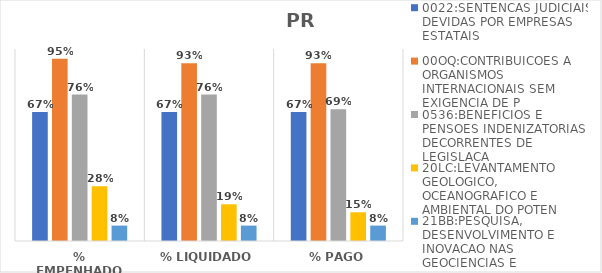
| Category | 0022:SENTENCAS JUDICIAIS DEVIDAS POR EMPRESAS ESTATAIS | 00OQ:CONTRIBUICOES A ORGANISMOS INTERNACIONAIS SEM EXIGENCIA DE P | 0536:BENEFICIOS E PENSOES INDENIZATORIAS DECORRENTES DE LEGISLACA | 20LC:LEVANTAMENTO GEOLOGICO, OCEANOGRAFICO E AMBIENTAL DO POTEN | 21BB:PESQUISA, DESENVOLVIMENTO E INOVACAO NAS GEOCIENCIAS E |
|---|---|---|---|---|---|
| % EMPENHADO | 0.671 | 0.95 | 0.763 | 0.285 | 0.08 |
| % LIQUIDADO | 0.671 | 0.926 | 0.763 | 0.191 | 0.08 |
| % PAGO | 0.671 | 0.926 | 0.687 | 0.15 | 0.08 |